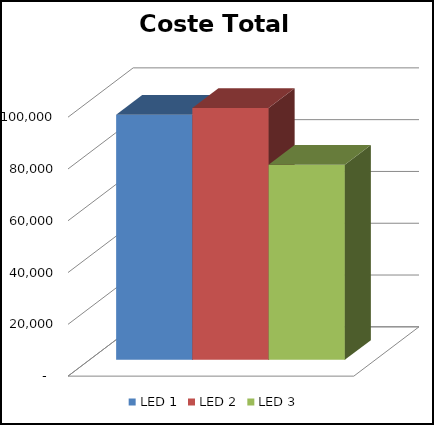
| Category | LED 1 | LED 2 | LED 3 |
|---|---|---|---|
| 0 | 94651.683 | 97235.911 | 75321.659 |